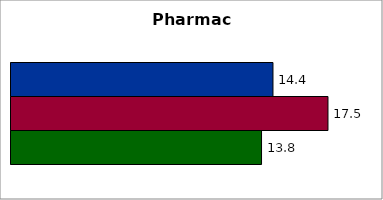
| Category | 50 states and D.C. | SREB states | State |
|---|---|---|---|
| 0 | 14.434 | 17.464 | 13.804 |